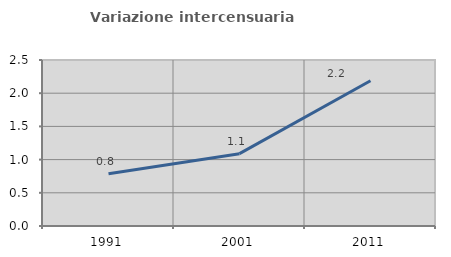
| Category | Variazione intercensuaria annua |
|---|---|
| 1991.0 | 0.788 |
| 2001.0 | 1.09 |
| 2011.0 | 2.187 |